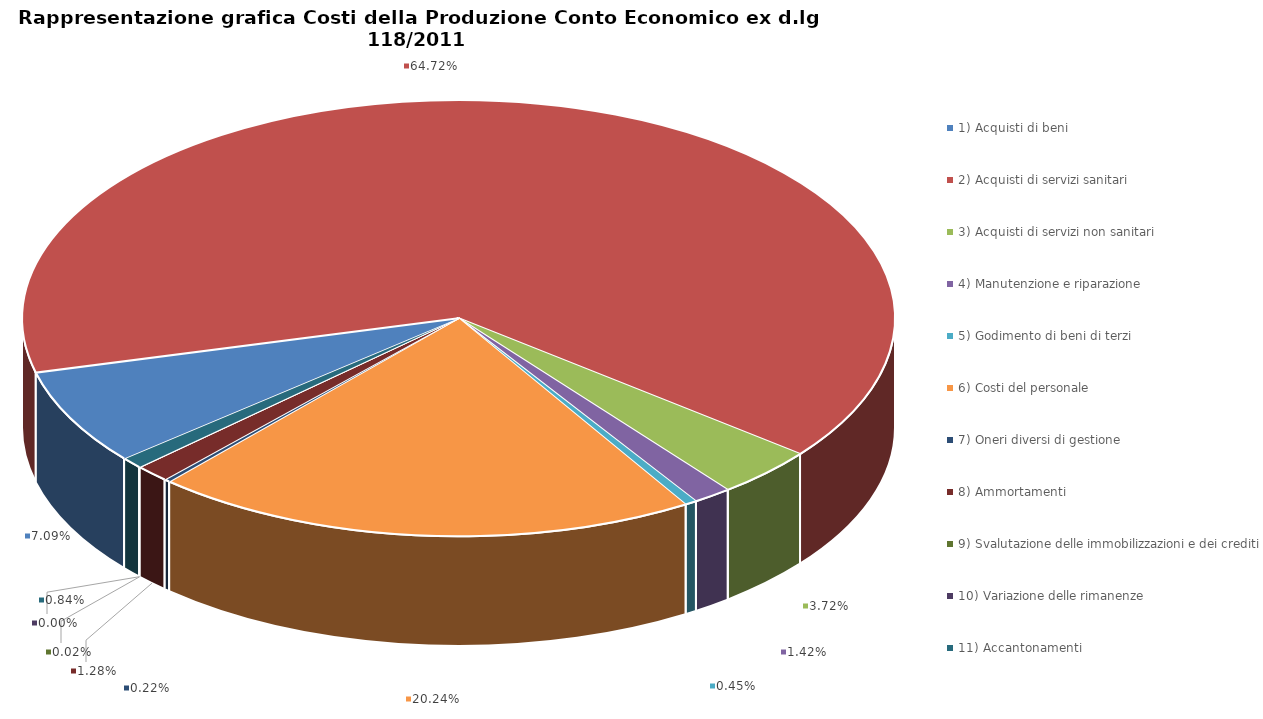
| Category | Series 0 |
|---|---|
| 1) Acquisti di beni | 0.071 |
| 2) Acquisti di servizi sanitari | 0.647 |
| 3) Acquisti di servizi non sanitari | 0.037 |
| 4) Manutenzione e riparazione | 0.014 |
| 5) Godimento di beni di terzi | 0.004 |
| 6) Costi del personale | 0.202 |
| 7) Oneri diversi di gestione | 0.002 |
| 8) Ammortamenti | 0.013 |
| 9) Svalutazione delle immobilizzazioni e dei crediti | 0 |
| 10) Variazione delle rimanenze | 0 |
| 11) Accantonamenti | 0.008 |